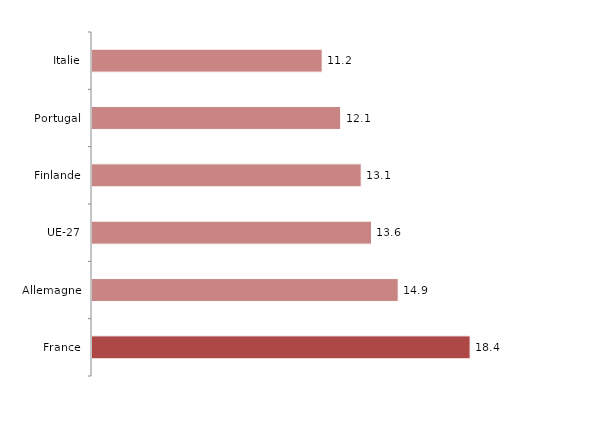
| Category | Series 0 |
|---|---|
| France | 18.4 |
| Allemagne | 14.9 |
| UE-27 | 13.6 |
| Finlande | 13.1 |
| Portugal | 12.1 |
| Italie | 11.2 |